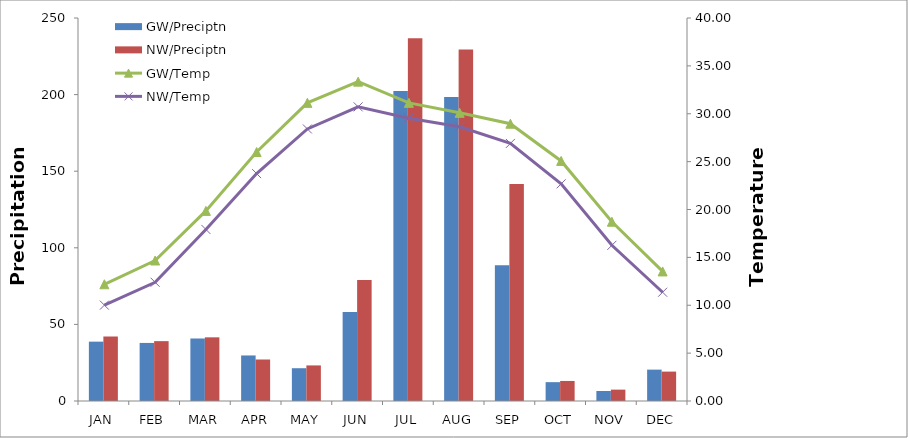
| Category | GW/Preciptn | NW/Preciptn |
|---|---|---|
| JAN | 38.74 | 42.13 |
| FEB | 37.9 | 39.07 |
| MAR | 40.8 | 41.56 |
| APR | 29.73 | 27.09 |
| MAY | 21.4 | 23.23 |
| JUN | 58.04 | 79.02 |
| JUL | 202.29 | 236.8 |
| AUG | 198.44 | 229.44 |
| SEP | 88.63 | 141.72 |
| OCT | 12.3 | 13.08 |
| NOV | 6.53 | 7.42 |
| DEC | 20.48 | 19.19 |